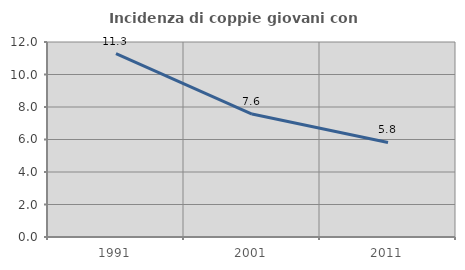
| Category | Incidenza di coppie giovani con figli |
|---|---|
| 1991.0 | 11.281 |
| 2001.0 | 7.564 |
| 2011.0 | 5.819 |